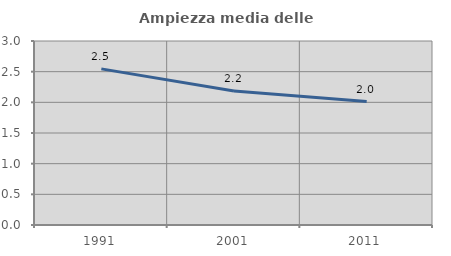
| Category | Ampiezza media delle famiglie |
|---|---|
| 1991.0 | 2.545 |
| 2001.0 | 2.186 |
| 2011.0 | 2.014 |